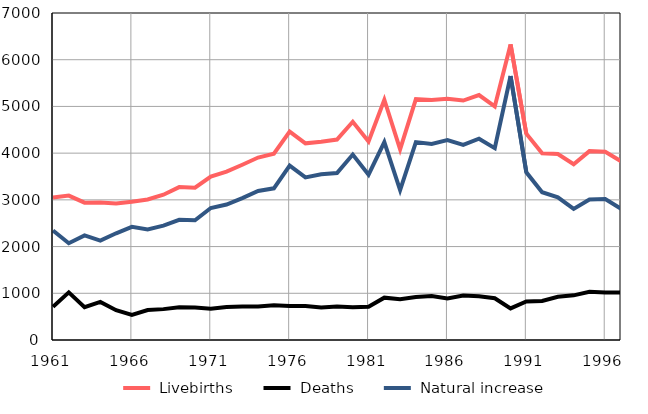
| Category |  Livebirths |  Deaths |  Natural increase |
|---|---|---|---|
| 1961.0 | 3052 | 709 | 2343 |
| 1962.0 | 3091 | 1019 | 2072 |
| 1963.0 | 2940 | 702 | 2238 |
| 1964.0 | 2944 | 816 | 2128 |
| 1965.0 | 2923 | 639 | 2284 |
| 1966.0 | 2959 | 537 | 2422 |
| 1967.0 | 3008 | 641 | 2367 |
| 1968.0 | 3110 | 661 | 2449 |
| 1969.0 | 3273 | 699 | 2574 |
| 1970.0 | 3259 | 697 | 2562 |
| 1971.0 | 3496 | 670 | 2826 |
| 1972.0 | 3603 | 704 | 2899 |
| 1973.0 | 3751 | 715 | 3036 |
| 1974.0 | 3906 | 715 | 3191 |
| 1975.0 | 3989 | 742 | 3247 |
| 1976.0 | 4460 | 727 | 3733 |
| 1977.0 | 4210 | 730 | 3480 |
| 1978.0 | 4245 | 698 | 3547 |
| 1979.0 | 4291 | 717 | 3574 |
| 1980.0 | 4672 | 702 | 3970 |
| 1981.0 | 4251 | 712 | 3539 |
| 1982.0 | 5143 | 906 | 4237 |
| 1983.0 | 4079 | 872 | 3207 |
| 1984.0 | 5158 | 922 | 4236 |
| 1985.0 | 5139 | 941 | 4198 |
| 1986.0 | 5166 | 888 | 4278 |
| 1987.0 | 5126 | 950 | 4176 |
| 1988.0 | 5243 | 934 | 4309 |
| 1989.0 | 5001 | 894 | 4107 |
| 1990.0 | 6328 | 677 | 5651 |
| 1991.0 | 4415 | 825 | 3590 |
| 1992.0 | 3998 | 834 | 3164 |
| 1993.0 | 3981 | 926 | 3055 |
| 1994.0 | 3763 | 956 | 2807 |
| 1995.0 | 4043 | 1034 | 3009 |
| 1996.0 | 4031 | 1015 | 3016 |
| 1997.0 | 3828 | 1017 | 2811 |